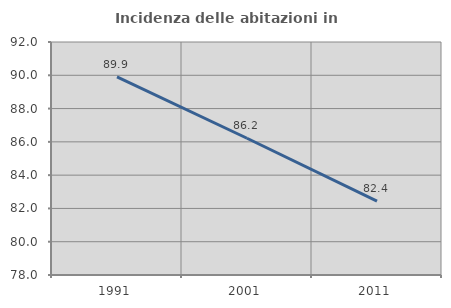
| Category | Incidenza delle abitazioni in proprietà  |
|---|---|
| 1991.0 | 89.901 |
| 2001.0 | 86.217 |
| 2011.0 | 82.44 |